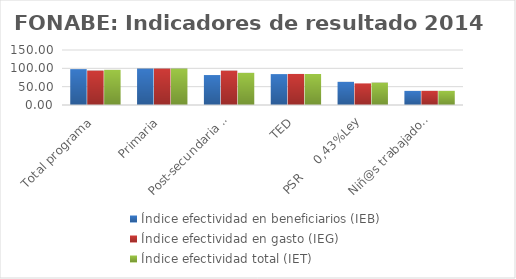
| Category | Índice efectividad en beneficiarios (IEB) | Índice efectividad en gasto (IEG)  | Índice efectividad total (IET) |
|---|---|---|---|
| Total programa | 97.832 | 93.881 | 95.857 |
| Primaria | 99.372 | 99.399 | 99.386 |
| Post-secundaria Regular | 81.688 | 93.719 | 87.703 |
| TED | 84.26 | 84.701 | 84.48 |
| PSR     0,43%Ley | 63.165 | 58.892 | 61.029 |
| Niñ@s trabajadores | 38.485 | 38.636 | 38.561 |